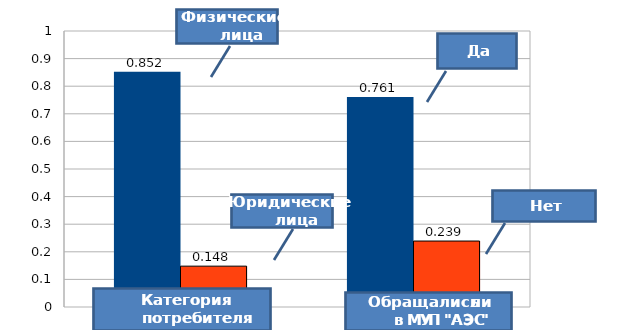
| Category | Series 0 | Series 1 |
|---|---|---|
| 0 | 0.852 | 0.148 |
| 1 | 0.761 | 0.239 |